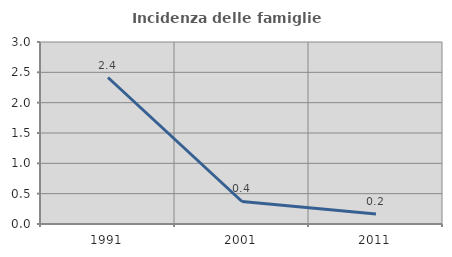
| Category | Incidenza delle famiglie numerose |
|---|---|
| 1991.0 | 2.414 |
| 2001.0 | 0.371 |
| 2011.0 | 0.164 |